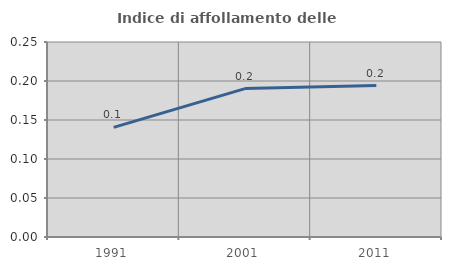
| Category | Indice di affollamento delle abitazioni  |
|---|---|
| 1991.0 | 0.141 |
| 2001.0 | 0.19 |
| 2011.0 | 0.194 |